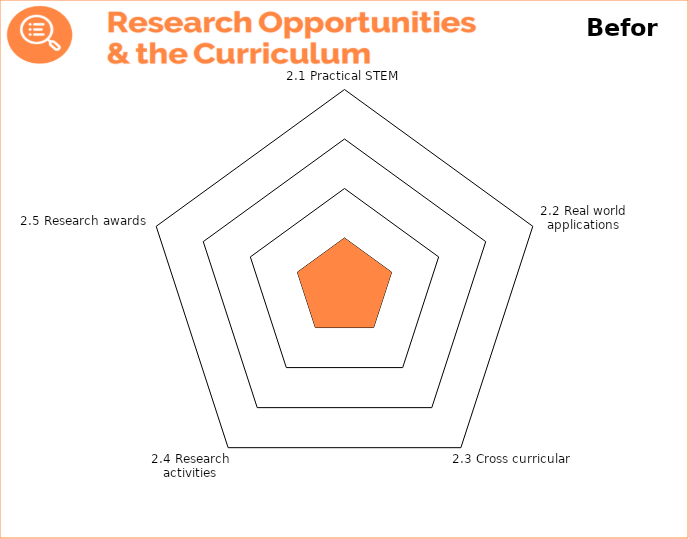
| Category | Theme 1: Leadership, Vision & Culture 

Before |
|---|---|
| 2.1 Practical STEM | 1 |
| 2.2 Real world applications | 1 |
| 2.3 Cross curricular | 1 |
| 2.4 Research activities | 1 |
| 2.5 Research awards | 1 |